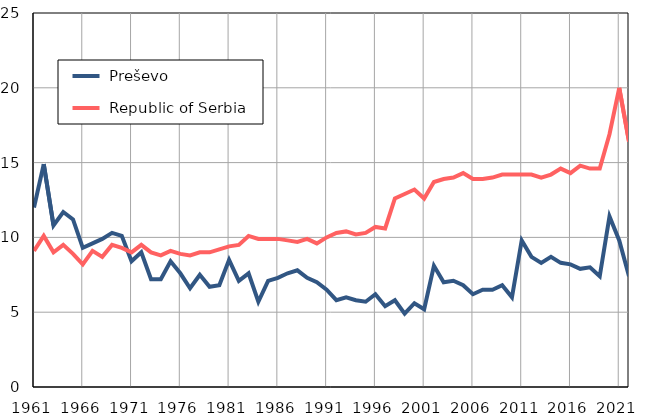
| Category |  Preševo |  Republic of Serbia |
|---|---|---|
| 1961.0 | 12 | 9.1 |
| 1962.0 | 14.9 | 10.1 |
| 1963.0 | 10.8 | 9 |
| 1964.0 | 11.7 | 9.5 |
| 1965.0 | 11.2 | 8.9 |
| 1966.0 | 9.3 | 8.2 |
| 1967.0 | 9.6 | 9.1 |
| 1968.0 | 9.9 | 8.7 |
| 1969.0 | 10.3 | 9.5 |
| 1970.0 | 10.1 | 9.3 |
| 1971.0 | 8.4 | 9 |
| 1972.0 | 9 | 9.5 |
| 1973.0 | 7.2 | 9 |
| 1974.0 | 7.2 | 8.8 |
| 1975.0 | 8.4 | 9.1 |
| 1976.0 | 7.6 | 8.9 |
| 1977.0 | 6.6 | 8.8 |
| 1978.0 | 7.5 | 9 |
| 1979.0 | 6.7 | 9 |
| 1980.0 | 6.8 | 9.2 |
| 1981.0 | 8.5 | 9.4 |
| 1982.0 | 7.1 | 9.5 |
| 1983.0 | 7.6 | 10.1 |
| 1984.0 | 5.7 | 9.9 |
| 1985.0 | 7.1 | 9.9 |
| 1986.0 | 7.3 | 9.9 |
| 1987.0 | 7.6 | 9.8 |
| 1988.0 | 7.8 | 9.7 |
| 1989.0 | 7.3 | 9.9 |
| 1990.0 | 7 | 9.6 |
| 1991.0 | 6.5 | 10 |
| 1992.0 | 5.8 | 10.3 |
| 1993.0 | 6 | 10.4 |
| 1994.0 | 5.8 | 10.2 |
| 1995.0 | 5.7 | 10.3 |
| 1996.0 | 6.2 | 10.7 |
| 1997.0 | 5.4 | 10.6 |
| 1998.0 | 5.8 | 12.6 |
| 1999.0 | 4.9 | 12.9 |
| 2000.0 | 5.6 | 13.2 |
| 2001.0 | 5.2 | 12.6 |
| 2002.0 | 8.1 | 13.7 |
| 2003.0 | 7 | 13.9 |
| 2004.0 | 7.1 | 14 |
| 2005.0 | 6.8 | 14.3 |
| 2006.0 | 6.2 | 13.9 |
| 2007.0 | 6.5 | 13.9 |
| 2008.0 | 6.5 | 14 |
| 2009.0 | 6.8 | 14.2 |
| 2010.0 | 6 | 14.2 |
| 2011.0 | 9.8 | 14.2 |
| 2012.0 | 8.7 | 14.2 |
| 2013.0 | 8.3 | 14 |
| 2014.0 | 8.7 | 14.2 |
| 2015.0 | 8.3 | 14.6 |
| 2016.0 | 8.2 | 14.3 |
| 2017.0 | 7.9 | 14.8 |
| 2018.0 | 8 | 14.6 |
| 2019.0 | 7.4 | 14.6 |
| 2020.0 | 11.4 | 16.9 |
| 2021.0 | 9.8 | 20 |
| 2022.0 | 7.4 | 16.4 |